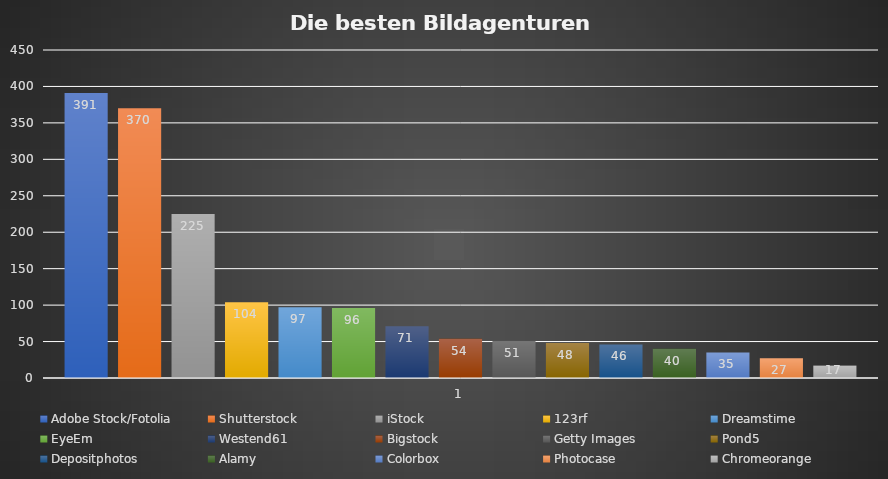
| Category | Adobe Stock/Fotolia | Shutterstock | iStock | 123rf | Dreamstime | EyeEm | Westend61 | Bigstock | Getty Images | Pond5 | Depositphotos | Alamy | Colorbox | Photocase | Chromeorange |
|---|---|---|---|---|---|---|---|---|---|---|---|---|---|---|---|
| 0 | 391 | 370 | 225 | 104 | 97 | 96 | 71 | 54 | 51 | 48 | 46 | 40 | 35 | 27 | 17 |